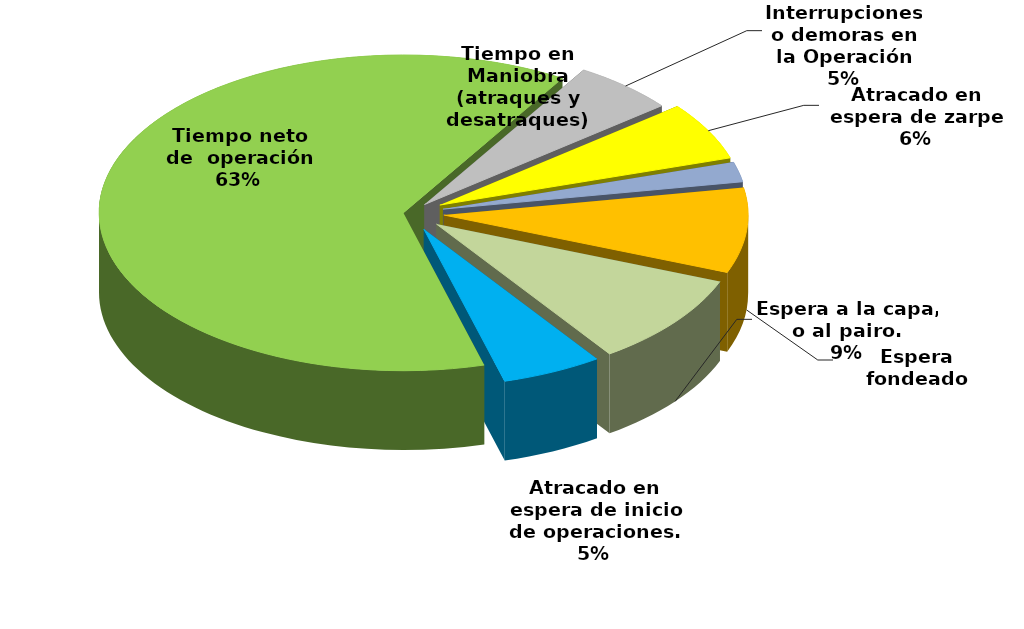
| Category | Series 0 |
|---|---|
| Espera fondeado | 3336.283 |
| Espera a la capa, o al pairo. | 3616.383 |
| Atracado en espera de inicio de operaciones. | 2050.044 |
| Tiempo neto de  operación | 24150.971 |
| Interrupciones o demoras en la Operación | 2099.61 |
| Atracado en espera de zarpe | 2273.604 |
| Tiempo en Maniobra (atraques y desatraques) | 789.267 |